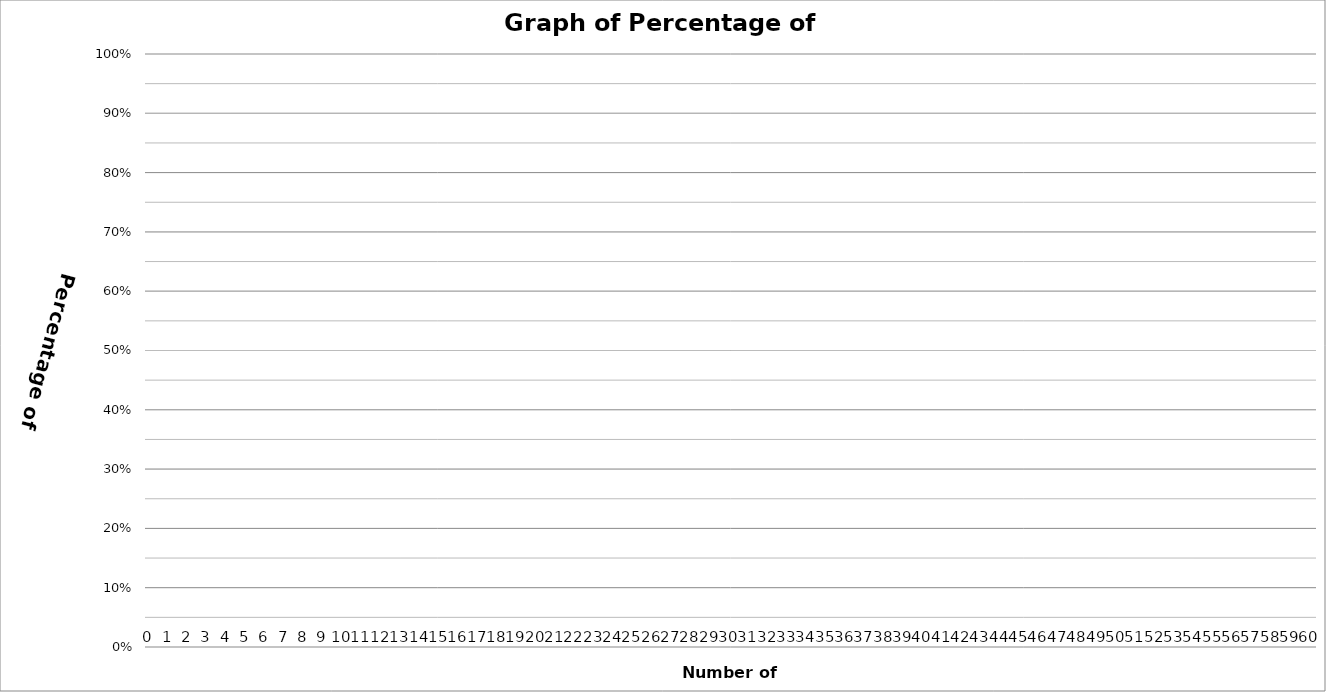
| Category | 0 | 1 | 2 | 3 | 4 | 5 | 6 | 7 | 8 | 9 | 10 | 11 | 12 | 13 | 14 | 15 | 16 | 17 | 18 | 19 | 20 | 21 | 22 | 23 | 24 | 25 | 26 | 27 | 28 | 29 | 30 | 31 | 32 | 33 | 34 | 35 | 36 | 37 | 38 | 39 | 40 | 41 | 42 | 43 | 44 | 45 | 46 | 47 | 48 | 49 | 50 | 51 | 52 | 53 | 54 | 55 | 56 | 57 | 58 | 59 | 60 |
|---|---|---|---|---|---|---|---|---|---|---|---|---|---|---|---|---|---|---|---|---|---|---|---|---|---|---|---|---|---|---|---|---|---|---|---|---|---|---|---|---|---|---|---|---|---|---|---|---|---|---|---|---|---|---|---|---|---|---|---|---|---|
| 0 | 0 | 0 | 0 | 0 | 0 | 0 | 0 | 0 | 0 | 0 | 0 | 0 | 0 | 0 | 0 | 0 | 0 | 0 | 0 | 0 | 0 | 0 | 0 | 0 | 0 | 0 | 0 | 0 | 0 | 0 | 0 | 0 | 0 | 0 | 0 | 0 | 0 | 0 | 0 | 0 | 0 | 0 | 0 | 0 | 0 | 0 | 0 | 0 | 0 | 0 | 0 | 0 | 0 | 0 | 0 | 0 | 0 | 0 | 0 | 0 | 0 |